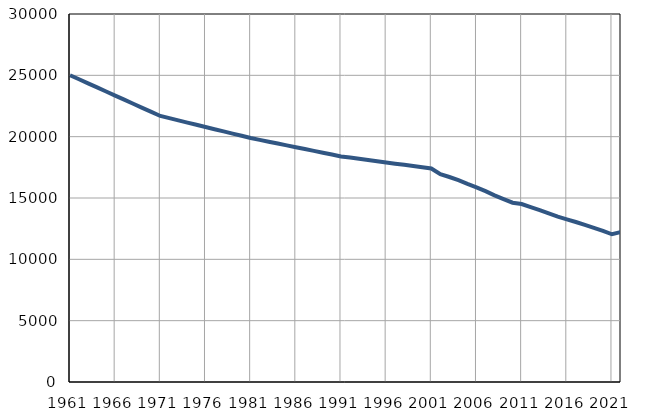
| Category | Population
size |
|---|---|
| 1961.0 | 25009 |
| 1962.0 | 24677 |
| 1963.0 | 24345 |
| 1964.0 | 24014 |
| 1965.0 | 23681 |
| 1966.0 | 23349 |
| 1967.0 | 23017 |
| 1968.0 | 22684 |
| 1969.0 | 22353 |
| 1970.0 | 22021 |
| 1971.0 | 21689 |
| 1972.0 | 21509 |
| 1973.0 | 21329 |
| 1974.0 | 21149 |
| 1975.0 | 20969 |
| 1976.0 | 20790 |
| 1977.0 | 20610 |
| 1978.0 | 20430 |
| 1979.0 | 20250 |
| 1980.0 | 20070 |
| 1981.0 | 19890 |
| 1982.0 | 19740 |
| 1983.0 | 19590 |
| 1984.0 | 19440 |
| 1985.0 | 19290 |
| 1986.0 | 19141 |
| 1987.0 | 18991 |
| 1988.0 | 18841 |
| 1989.0 | 18691 |
| 1990.0 | 18541 |
| 1991.0 | 18391 |
| 1992.0 | 18293 |
| 1993.0 | 18194 |
| 1994.0 | 18096 |
| 1995.0 | 17997 |
| 1996.0 | 17899 |
| 1997.0 | 17800 |
| 1998.0 | 17702 |
| 1999.0 | 17603 |
| 2000.0 | 17505 |
| 2001.0 | 17406 |
| 2002.0 | 16936 |
| 2003.0 | 16710 |
| 2004.0 | 16454 |
| 2005.0 | 16154 |
| 2006.0 | 15873 |
| 2007.0 | 15557 |
| 2008.0 | 15214 |
| 2009.0 | 14906 |
| 2010.0 | 14615 |
| 2011.0 | 14507 |
| 2012.0 | 14252 |
| 2013.0 | 14015 |
| 2014.0 | 13753 |
| 2015.0 | 13477 |
| 2016.0 | 13256 |
| 2017.0 | 13045 |
| 2018.0 | 12805 |
| 2019.0 | 12568 |
| 2020.0 | 12320 |
| 2021.0 | 12043 |
| 2022.0 | 12233 |